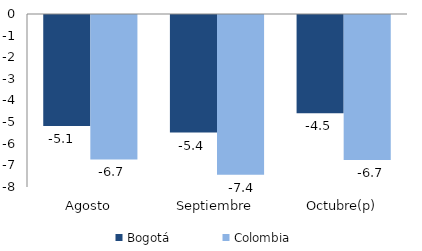
| Category | Bogotá | Colombia |
|---|---|---|
| Agosto | -5.129 | -6.681 |
| Septiembre | -5.438 | -7.391 |
| Octubre(p) | -4.546 | -6.708 |